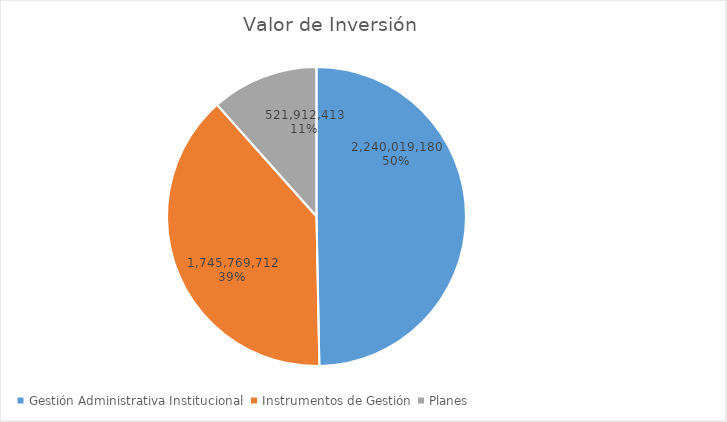
| Category | Valor de Inversión | Porcentaje de Ejecución dentro de la Actividad |
|---|---|---|
| Gestión Administrativa Institucional | 2240019180 | 6 |
| Instrumentos de Gestión | 1745769712 | 6 |
| Planes | 521912413 | 4 |